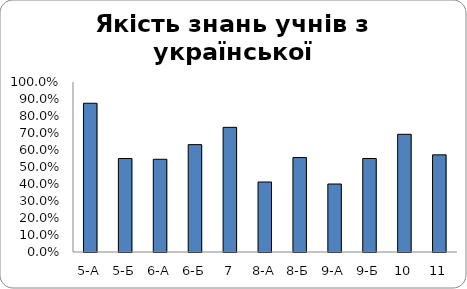
| Category | Series 0 |
|---|---|
| 5-А | 0.875 |
| 5-Б | 0.55 |
| 6-А | 0.545 |
| 6-Б | 0.632 |
| 7 | 0.733 |
| 8-А | 0.412 |
| 8-Б | 0.556 |
| 9-А | 0.4 |
| 9-Б | 0.55 |
| 10 | 0.692 |
| 11 | 0.571 |